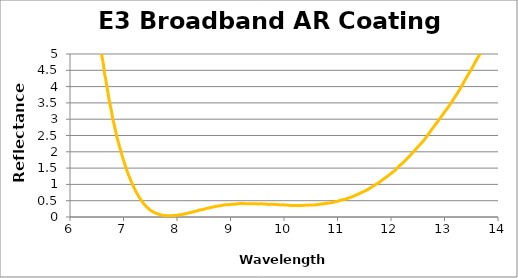
| Category | Reflectance (%) |
|---|---|
| 4.998841805 | 35.956 |
| 5.006891469999999 | 35.833 |
| 5.014941135 | 35.708 |
| 5.0229907990000005 | 35.578 |
| 5.031040463999999 | 35.447 |
| 5.039090129 | 35.316 |
| 5.047139794 | 35.184 |
| 5.055189458 | 35.05 |
| 5.063239123000001 | 34.912 |
| 5.0712887879999995 | 34.773 |
| 5.079338453 | 34.632 |
| 5.087388117000001 | 34.493 |
| 5.095437782 | 34.353 |
| 5.103487447 | 34.211 |
| 5.111537112 | 34.069 |
| 5.119586776 | 33.924 |
| 5.127636441 | 33.779 |
| 5.1356861060000005 | 33.634 |
| 5.143735770999999 | 33.486 |
| 5.151785435 | 33.334 |
| 5.1598351000000005 | 33.185 |
| 5.167884765 | 33.035 |
| 5.17593443 | 32.882 |
| 5.183984094 | 32.727 |
| 5.192033759 | 32.572 |
| 5.200083424000001 | 32.412 |
| 5.208133087999999 | 32.251 |
| 5.216182753 | 32.087 |
| 5.224232418 | 31.928 |
| 5.232282083 | 31.771 |
| 5.240331747 | 31.603 |
| 5.248381412 | 31.435 |
| 5.256431077 | 31.271 |
| 5.264480742 | 31.105 |
| 5.272530406 | 30.936 |
| 5.280580071 | 30.766 |
| 5.288629736 | 30.597 |
| 5.2966794010000005 | 30.424 |
| 5.304729065 | 30.257 |
| 5.31277873 | 30.09 |
| 5.3208283949999995 | 29.919 |
| 5.32887806 | 29.746 |
| 5.336927724 | 29.578 |
| 5.344977388999999 | 29.41 |
| 5.353027054 | 29.224 |
| 5.361076719 | 29.042 |
| 5.369126383 | 28.875 |
| 5.377176048 | 28.703 |
| 5.385225713 | 28.525 |
| 5.393275378 | 28.347 |
| 5.401325042000001 | 28.169 |
| 5.409374707 | 27.992 |
| 5.417424372 | 27.81 |
| 5.425474037 | 27.611 |
| 5.433523701 | 27.427 |
| 5.441573365999999 | 27.254 |
| 5.449623031 | 27.074 |
| 5.4576726959999995 | 26.895 |
| 5.46572236 | 26.702 |
| 5.473772025000001 | 26.508 |
| 5.481821689999999 | 26.322 |
| 5.489871354 | 26.139 |
| 5.4979210190000005 | 25.96 |
| 5.505970684 | 25.775 |
| 5.514020349 | 25.591 |
| 5.5220700129999996 | 25.401 |
| 5.530119678 | 25.211 |
| 5.538169343 | 25.03 |
| 5.5462190080000004 | 24.851 |
| 5.554268672 | 24.657 |
| 5.562318337 | 24.465 |
| 5.570368002 | 24.286 |
| 5.578417667 | 24.09 |
| 5.586467331 | 23.887 |
| 5.594516996 | 23.71 |
| 5.602566661 | 23.532 |
| 5.610616326000001 | 23.343 |
| 5.61866599 | 23.151 |
| 5.626715655 | 22.971 |
| 5.6347653200000005 | 22.795 |
| 5.642814985 | 22.589 |
| 5.650864649 | 22.376 |
| 5.658914314 | 22.191 |
| 5.666963979 | 22.02 |
| 5.675013644 | 21.834 |
| 5.6830633079999995 | 21.637 |
| 5.691112973 | 21.448 |
| 5.699162638 | 21.267 |
| 5.707212303 | 21.086 |
| 5.715261967 | 20.88 |
| 5.723311632 | 20.673 |
| 5.731361297 | 20.493 |
| 5.739410962 | 20.316 |
| 5.747460626 | 20.131 |
| 5.755510290999999 | 19.953 |
| 5.763559956 | 19.769 |
| 5.77160962 | 19.551 |
| 5.779659285 | 19.353 |
| 5.78770895 | 19.185 |
| 5.795758615 | 19.017 |
| 5.803808279 | 18.846 |
| 5.811857944000001 | 18.68 |
| 5.8199076089999995 | 18.491 |
| 5.827957274 | 18.255 |
| 5.836006938000001 | 18.056 |
| 5.844056603 | 17.895 |
| 5.852106267999999 | 17.738 |
| 5.860155933 | 17.561 |
| 5.868205597 | 17.379 |
| 5.876255262 | 17.202 |
| 5.8843049270000005 | 16.998 |
| 5.892354591999999 | 16.783 |
| 5.900404256 | 16.592 |
| 5.908453921 | 16.429 |
| 5.916503586 | 16.277 |
| 5.924553251 | 16.12 |
| 5.932602915 | 15.943 |
| 5.94065258 | 15.714 |
| 5.948702245000001 | 15.519 |
| 5.95675191 | 15.373 |
| 5.964801574 | 15.217 |
| 5.972851239 | 15.04 |
| 5.980900904 | 14.864 |
| 5.988950569 | 14.677 |
| 5.997000233 | 14.491 |
| 6.005049898 | 14.333 |
| 6.013099563 | 14.168 |
| 6.0211492280000005 | 13.989 |
| 6.029198892 | 13.836 |
| 6.037248557 | 13.705 |
| 6.045298222 | 13.528 |
| 6.053347885999999 | 13.298 |
| 6.061397551 | 13.122 |
| 6.0694472159999995 | 12.965 |
| 6.077496881 | 12.78 |
| 6.085546545000001 | 12.619 |
| 6.093596209999999 | 12.489 |
| 6.101645875 | 12.355 |
| 6.10969554 | 12.186 |
| 6.117745204 | 11.989 |
| 6.125794869 | 11.83 |
| 6.133844534 | 11.703 |
| 6.141894199 | 11.57 |
| 6.149943863000001 | 11.428 |
| 6.1579935279999996 | 11.28 |
| 6.166043193 | 11.137 |
| 6.174092858 | 11.016 |
| 6.182142522 | 10.887 |
| 6.190192187 | 10.738 |
| 6.198241852 | 10.605 |
| 6.2062915169999995 | 10.489 |
| 6.214341181 | 10.368 |
| 6.222390846000001 | 10.239 |
| 6.230440510999999 | 10.108 |
| 6.238490176 | 9.976 |
| 6.2465398400000005 | 9.843 |
| 6.254589505 | 9.714 |
| 6.262639170000001 | 9.585 |
| 6.270688835 | 9.452 |
| 6.278738499 | 9.317 |
| 6.286788164 | 9.184 |
| 6.294837829 | 9.051 |
| 6.302887493 | 8.92 |
| 6.310937158 | 8.794 |
| 6.318986823 | 8.671 |
| 6.327036488 | 8.553 |
| 6.335086152 | 8.434 |
| 6.343135817 | 8.297 |
| 6.351185482 | 8.158 |
| 6.359235147000001 | 8.042 |
| 6.367284811 | 7.928 |
| 6.375334476 | 7.799 |
| 6.3833841410000005 | 7.676 |
| 6.391433806 | 7.571 |
| 6.39948347 | 7.48 |
| 6.4075331349999995 | 7.376 |
| 6.4155828 | 7.218 |
| 6.423632465 | 7.059 |
| 6.4316821289999995 | 6.949 |
| 6.439731794 | 6.857 |
| 6.447781459 | 6.761 |
| 6.455831124 | 6.662 |
| 6.463880788 | 6.569 |
| 6.471930453 | 6.479 |
| 6.479980118 | 6.38 |
| 6.488029783 | 6.251 |
| 6.4960794470000005 | 6.111 |
| 6.504129111999999 | 6.007 |
| 6.512178777 | 5.926 |
| 6.520228442 | 5.835 |
| 6.528278106 | 5.736 |
| 6.536327771 | 5.645 |
| 6.5443774359999995 | 5.56 |
| 6.552427101 | 5.471 |
| 6.560476765000001 | 5.379 |
| 6.5685264299999995 | 5.279 |
| 6.576576095 | 5.174 |
| 6.584625759 | 5.074 |
| 6.592675424 | 4.983 |
| 6.600725089 | 4.9 |
| 6.608774754 | 4.826 |
| 6.616824418 | 4.757 |
| 6.624874083 | 4.68 |
| 6.6329237480000005 | 4.577 |
| 6.640973412999999 | 4.453 |
| 6.649023077 | 4.362 |
| 6.657072742 | 4.304 |
| 6.665122407 | 4.244 |
| 6.673172072000001 | 4.167 |
| 6.681221736 | 4.076 |
| 6.689271401 | 3.992 |
| 6.697321066000001 | 3.923 |
| 6.705370731 | 3.853 |
| 6.713420395 | 3.773 |
| 6.72147006 | 3.689 |
| 6.729519725 | 3.613 |
| 6.73756939 | 3.545 |
| 6.745619054 | 3.479 |
| 6.753668719 | 3.412 |
| 6.761718384 | 3.348 |
| 6.7697680490000005 | 3.286 |
| 6.777817713 | 3.22 |
| 6.785867378 | 3.141 |
| 6.793917043 | 3.059 |
| 6.801966708 | 2.992 |
| 6.810016372 | 2.938 |
| 6.8180660369999995 | 2.884 |
| 6.826115702 | 2.823 |
| 6.834165367 | 2.76 |
| 6.842215030999999 | 2.707 |
| 6.850264696 | 2.66 |
| 6.858314361 | 2.6 |
| 6.866364025 | 2.526 |
| 6.87441369 | 2.464 |
| 6.882463355 | 2.417 |
| 6.89051302 | 2.374 |
| 6.898562684000001 | 2.327 |
| 6.906612349 | 2.276 |
| 6.914662014 | 2.223 |
| 6.922711679 | 2.174 |
| 6.930761343 | 2.129 |
| 6.938811008 | 2.087 |
| 6.946860673 | 2.043 |
| 6.9549103379999995 | 1.994 |
| 6.962960002 | 1.941 |
| 6.971009667000001 | 1.89 |
| 6.979059331999999 | 1.848 |
| 6.987108997 | 1.808 |
| 6.9951586610000005 | 1.766 |
| 7.003208326 | 1.724 |
| 7.011257991000001 | 1.682 |
| 7.019307656 | 1.642 |
| 7.02735732 | 1.601 |
| 7.035406985 | 1.562 |
| 7.04345665 | 1.519 |
| 7.051506314999999 | 1.475 |
| 7.059555979 | 1.435 |
| 7.067605644 | 1.4 |
| 7.075655309 | 1.368 |
| 7.083704974000001 | 1.335 |
| 7.091754638 | 1.301 |
| 7.099804303 | 1.267 |
| 7.107853968000001 | 1.234 |
| 7.115903633 | 1.201 |
| 7.123953297 | 1.168 |
| 7.132002962 | 1.137 |
| 7.140052627 | 1.107 |
| 7.148102291 | 1.077 |
| 7.1561519559999995 | 1.045 |
| 7.164201621 | 1.014 |
| 7.172251286 | 0.983 |
| 7.1803009499999995 | 0.955 |
| 7.188350615 | 0.929 |
| 7.19640028 | 0.903 |
| 7.204449945 | 0.876 |
| 7.212499609 | 0.847 |
| 7.220549274 | 0.82 |
| 7.228598939 | 0.795 |
| 7.236648604 | 0.772 |
| 7.2446982680000005 | 0.749 |
| 7.252747932999999 | 0.725 |
| 7.260797598 | 0.702 |
| 7.268847263 | 0.677 |
| 7.276896927 | 0.652 |
| 7.284946592 | 0.627 |
| 7.2929962569999995 | 0.605 |
| 7.301045922 | 0.586 |
| 7.309095586000001 | 0.567 |
| 7.317145251 | 0.548 |
| 7.325194916 | 0.53 |
| 7.333244581 | 0.51 |
| 7.341294245 | 0.49 |
| 7.34934391 | 0.47 |
| 7.357393575 | 0.451 |
| 7.365443239999999 | 0.434 |
| 7.373492904 | 0.418 |
| 7.3815425690000005 | 0.402 |
| 7.389592233999999 | 0.388 |
| 7.397641898 | 0.373 |
| 7.405691563 | 0.359 |
| 7.413741228 | 0.345 |
| 7.421790893000001 | 0.33 |
| 7.429840557 | 0.316 |
| 7.437890222 | 0.302 |
| 7.445939887000001 | 0.29 |
| 7.453989552 | 0.278 |
| 7.462039216 | 0.267 |
| 7.470088881 | 0.254 |
| 7.478138546 | 0.242 |
| 7.486188211 | 0.23 |
| 7.494237875 | 0.219 |
| 7.50228754 | 0.209 |
| 7.510337205 | 0.199 |
| 7.5183868700000005 | 0.191 |
| 7.526436534 | 0.182 |
| 7.534486199 | 0.174 |
| 7.542535864 | 0.166 |
| 7.550585529 | 0.158 |
| 7.558635193 | 0.15 |
| 7.5666848579999995 | 0.144 |
| 7.574734523 | 0.137 |
| 7.582784188 | 0.132 |
| 7.590833851999999 | 0.127 |
| 7.598883517 | 0.122 |
| 7.606933182 | 0.117 |
| 7.614982847 | 0.111 |
| 7.623032511 | 0.106 |
| 7.631082176 | 0.1 |
| 7.639131841 | 0.095 |
| 7.647181506 | 0.091 |
| 7.65523117 | 0.087 |
| 7.663280834999999 | 0.084 |
| 7.6713305 | 0.081 |
| 7.679380164 | 0.078 |
| 7.687429829 | 0.074 |
| 7.695479494 | 0.07 |
| 7.7035291589999995 | 0.065 |
| 7.711578823 | 0.06 |
| 7.719628488000001 | 0.056 |
| 7.727678153 | 0.052 |
| 7.735727818 | 0.051 |
| 7.7437774820000005 | 0.049 |
| 7.751827147 | 0.048 |
| 7.759876812000001 | 0.047 |
| 7.767926477 | 0.045 |
| 7.775976141 | 0.043 |
| 7.784025806 | 0.042 |
| 7.792075471 | 0.041 |
| 7.800125135999999 | 0.039 |
| 7.8081748 | 0.037 |
| 7.816224465 | 0.036 |
| 7.82427413 | 0.036 |
| 7.832323795000001 | 0.037 |
| 7.840373459 | 0.038 |
| 7.848423124 | 0.039 |
| 7.856472789000001 | 0.04 |
| 7.864522454 | 0.041 |
| 7.872572118 | 0.041 |
| 7.880621783 | 0.041 |
| 7.888671448 | 0.041 |
| 7.896721113 | 0.041 |
| 7.9047707769999995 | 0.041 |
| 7.912820442 | 0.042 |
| 7.920870107 | 0.043 |
| 7.928919772 | 0.044 |
| 7.936969436 | 0.046 |
| 7.945019101 | 0.048 |
| 7.953068766 | 0.049 |
| 7.961118430000001 | 0.049 |
| 7.969168095 | 0.05 |
| 7.97721776 | 0.051 |
| 7.985267425 | 0.052 |
| 7.9933170890000005 | 0.054 |
| 8.001366754 | 0.056 |
| 8.009416419 | 0.057 |
| 8.017466084 | 0.059 |
| 8.025515748 | 0.061 |
| 8.033565413 | 0.063 |
| 8.041615078 | 0.065 |
| 8.049664743000001 | 0.068 |
| 8.057714407 | 0.069 |
| 8.065764072 | 0.071 |
| 8.073813737 | 0.072 |
| 8.081863402 | 0.073 |
| 8.089913066 | 0.075 |
| 8.097962730999999 | 0.078 |
| 8.106012396 | 0.081 |
| 8.114062061 | 0.085 |
| 8.122111725 | 0.089 |
| 8.13016139 | 0.092 |
| 8.138211055 | 0.095 |
| 8.14626072 | 0.097 |
| 8.154310384 | 0.099 |
| 8.162360049 | 0.102 |
| 8.170409714 | 0.104 |
| 8.178459379 | 0.107 |
| 8.186509043 | 0.111 |
| 8.194558708 | 0.115 |
| 8.202608372999999 | 0.119 |
| 8.210658038 | 0.122 |
| 8.218707702 | 0.126 |
| 8.226757367 | 0.129 |
| 8.234807032 | 0.132 |
| 8.242856696 | 0.134 |
| 8.250906361 | 0.138 |
| 8.258956026 | 0.141 |
| 8.267005691 | 0.144 |
| 8.275055355000001 | 0.147 |
| 8.28310502 | 0.15 |
| 8.291154684999999 | 0.153 |
| 8.29920435 | 0.157 |
| 8.307254014 | 0.16 |
| 8.315303679000001 | 0.164 |
| 8.323353344 | 0.168 |
| 8.331403008999999 | 0.171 |
| 8.339452673 | 0.175 |
| 8.347502338 | 0.177 |
| 8.355552003000001 | 0.18 |
| 8.363601668 | 0.183 |
| 8.371651331999999 | 0.186 |
| 8.379700997 | 0.189 |
| 8.387750662 | 0.194 |
| 8.395800327000002 | 0.198 |
| 8.403849991 | 0.203 |
| 8.411899656 | 0.208 |
| 8.419949321 | 0.212 |
| 8.427998986 | 0.215 |
| 8.43604865 | 0.218 |
| 8.444098315 | 0.22 |
| 8.45214798 | 0.221 |
| 8.460197645000001 | 0.223 |
| 8.468247309 | 0.224 |
| 8.476296974 | 0.226 |
| 8.484346639 | 0.229 |
| 8.492396303 | 0.232 |
| 8.500445968 | 0.236 |
| 8.508495633 | 0.24 |
| 8.516545297999999 | 0.244 |
| 8.524594961999998 | 0.248 |
| 8.532644627 | 0.252 |
| 8.540694292 | 0.256 |
| 8.548743957000001 | 0.26 |
| 8.556793621 | 0.264 |
| 8.564843285999999 | 0.267 |
| 8.572892951 | 0.269 |
| 8.580942616 | 0.271 |
| 8.588992280000001 | 0.274 |
| 8.597041945 | 0.276 |
| 8.605091609999999 | 0.279 |
| 8.613141275 | 0.283 |
| 8.621190939 | 0.287 |
| 8.629240604000001 | 0.291 |
| 8.637290269 | 0.296 |
| 8.645339933999999 | 0.299 |
| 8.653389598 | 0.303 |
| 8.661439263 | 0.305 |
| 8.669488928 | 0.307 |
| 8.677538593 | 0.308 |
| 8.685588257 | 0.31 |
| 8.693637922 | 0.312 |
| 8.701687587 | 0.314 |
| 8.709737252 | 0.318 |
| 8.717786916 | 0.322 |
| 8.725836581 | 0.327 |
| 8.733886246 | 0.33 |
| 8.741935911 | 0.333 |
| 8.749985575 | 0.334 |
| 8.75803524 | 0.335 |
| 8.766084905 | 0.337 |
| 8.774134569 | 0.339 |
| 8.782184234 | 0.341 |
| 8.790233899 | 0.343 |
| 8.798283564 | 0.345 |
| 8.806333228 | 0.346 |
| 8.814382893 | 0.348 |
| 8.822432558000001 | 0.35 |
| 8.830482223 | 0.353 |
| 8.838531886999998 | 0.356 |
| 8.846581552 | 0.359 |
| 8.854631217 | 0.362 |
| 8.862680882000001 | 0.365 |
| 8.870730546 | 0.368 |
| 8.878780210999999 | 0.37 |
| 8.886829876 | 0.372 |
| 8.894879541 | 0.374 |
| 8.902929205 | 0.376 |
| 8.910978870000001 | 0.377 |
| 8.919028534999999 | 0.378 |
| 8.9270782 | 0.378 |
| 8.935127864 | 0.378 |
| 8.943177529 | 0.378 |
| 8.951227194 | 0.378 |
| 8.959276859 | 0.378 |
| 8.967326523 | 0.379 |
| 8.975376188 | 0.38 |
| 8.983425853 | 0.382 |
| 8.991475518 | 0.384 |
| 8.999525182 | 0.386 |
| 9.007574846999999 | 0.388 |
| 9.015624512 | 0.389 |
| 9.023674177 | 0.39 |
| 9.031723841000002 | 0.39 |
| 9.039773506 | 0.391 |
| 9.047823171 | 0.391 |
| 9.055872835 | 0.391 |
| 9.0639225 | 0.391 |
| 9.071972165 | 0.392 |
| 9.08002183 | 0.393 |
| 9.088071494 | 0.394 |
| 9.096121159 | 0.396 |
| 9.104170824 | 0.398 |
| 9.112220488999998 | 0.399 |
| 9.120270153 | 0.401 |
| 9.128319818 | 0.402 |
| 9.136369483000001 | 0.404 |
| 9.144419148 | 0.405 |
| 9.152468811999999 | 0.407 |
| 9.160518477 | 0.409 |
| 9.168568142 | 0.411 |
| 9.176617807000001 | 0.412 |
| 9.184667471000001 | 0.413 |
| 9.192717135999999 | 0.413 |
| 9.200766801 | 0.413 |
| 9.208816466 | 0.413 |
| 9.21686613 | 0.413 |
| 9.224915795000001 | 0.413 |
| 9.232965459999999 | 0.413 |
| 9.241015125 | 0.412 |
| 9.249064789 | 0.412 |
| 9.257114454 | 0.411 |
| 9.265164119 | 0.41 |
| 9.273213784 | 0.409 |
| 9.281263447999999 | 0.409 |
| 9.289313113 | 0.409 |
| 9.297362778 | 0.409 |
| 9.305412443 | 0.409 |
| 9.313462107 | 0.41 |
| 9.321511772 | 0.41 |
| 9.329561437 | 0.41 |
| 9.337611101 | 0.41 |
| 9.345660766000002 | 0.41 |
| 9.353710431 | 0.409 |
| 9.361760096 | 0.408 |
| 9.36980976 | 0.407 |
| 9.377859425 | 0.406 |
| 9.385909089999998 | 0.407 |
| 9.393958755 | 0.407 |
| 9.402008419 | 0.408 |
| 9.410058084000001 | 0.409 |
| 9.418107749 | 0.41 |
| 9.426157413999999 | 0.41 |
| 9.434207078 | 0.41 |
| 9.442256743 | 0.409 |
| 9.450306408000001 | 0.41 |
| 9.458356073000001 | 0.41 |
| 9.466405736999999 | 0.409 |
| 9.474455402 | 0.409 |
| 9.482505067 | 0.407 |
| 9.490554732 | 0.405 |
| 9.498604396000001 | 0.403 |
| 9.506654060999999 | 0.401 |
| 9.514703726 | 0.399 |
| 9.522753391 | 0.399 |
| 9.530803055 | 0.4 |
| 9.538852720000001 | 0.401 |
| 9.546902385 | 0.403 |
| 9.55495205 | 0.404 |
| 9.563001714 | 0.405 |
| 9.571051379 | 0.405 |
| 9.579101044 | 0.405 |
| 9.587150708 | 0.404 |
| 9.595200372999999 | 0.403 |
| 9.603250038 | 0.402 |
| 9.611299703 | 0.402 |
| 9.619349367 | 0.401 |
| 9.627399032 | 0.401 |
| 9.635448697 | 0.401 |
| 9.643498362 | 0.4 |
| 9.651548026 | 0.399 |
| 9.659597691 | 0.397 |
| 9.667647356 | 0.395 |
| 9.675697021 | 0.392 |
| 9.683746685000001 | 0.39 |
| 9.69179635 | 0.388 |
| 9.699846014999999 | 0.387 |
| 9.70789568 | 0.386 |
| 9.715945344 | 0.386 |
| 9.723995009 | 0.386 |
| 9.732044674 | 0.387 |
| 9.740094338999999 | 0.387 |
| 9.748144003 | 0.388 |
| 9.756193668 | 0.389 |
| 9.764243333 | 0.39 |
| 9.772292998000001 | 0.39 |
| 9.780342661999999 | 0.39 |
| 9.788392327 | 0.39 |
| 9.796441992 | 0.389 |
| 9.804491657 | 0.389 |
| 9.812541321000001 | 0.388 |
| 9.820590986 | 0.387 |
| 9.828640650999999 | 0.387 |
| 9.836690316 | 0.386 |
| 9.84473998 | 0.386 |
| 9.852789645000001 | 0.385 |
| 9.86083931 | 0.384 |
| 9.868888973999999 | 0.382 |
| 9.876938639 | 0.38 |
| 9.884988304 | 0.378 |
| 9.893037969000002 | 0.376 |
| 9.901087633 | 0.375 |
| 9.909137298 | 0.373 |
| 9.917186963 | 0.372 |
| 9.925236628 | 0.372 |
| 9.933286292 | 0.372 |
| 9.941335957 | 0.372 |
| 9.949385622 | 0.373 |
| 9.957435287000001 | 0.373 |
| 9.965484951 | 0.373 |
| 9.973534616 | 0.374 |
| 9.981584281 | 0.373 |
| 9.989633946 | 0.373 |
| 9.99768361 | 0.372 |
| 10.005733275 | 0.372 |
| 10.013782939999999 | 0.372 |
| 10.021832605 | 0.372 |
| 10.029882269 | 0.372 |
| 10.037931934 | 0.371 |
| 10.045981599000001 | 0.37 |
| 10.054031263999999 | 0.368 |
| 10.062080927999999 | 0.366 |
| 10.070130593 | 0.364 |
| 10.078180258 | 0.362 |
| 10.086229923000001 | 0.36 |
| 10.094279587 | 0.359 |
| 10.102329251999999 | 0.358 |
| 10.110378917 | 0.356 |
| 10.118428582 | 0.355 |
| 10.126478246000001 | 0.354 |
| 10.134527911 | 0.353 |
| 10.142577575999999 | 0.353 |
| 10.15062724 | 0.352 |
| 10.158676905 | 0.353 |
| 10.166726570000002 | 0.353 |
| 10.174776235 | 0.353 |
| 10.182825899 | 0.354 |
| 10.190875564 | 0.354 |
| 10.198925229 | 0.354 |
| 10.206974894 | 0.353 |
| 10.215024558 | 0.352 |
| 10.223074223 | 0.351 |
| 10.231123888 | 0.351 |
| 10.239173553 | 0.351 |
| 10.247223217 | 0.351 |
| 10.255272882 | 0.351 |
| 10.263322547 | 0.352 |
| 10.271372212000001 | 0.354 |
| 10.279421876 | 0.355 |
| 10.287471541 | 0.356 |
| 10.295521206 | 0.356 |
| 10.303570871 | 0.356 |
| 10.311620535 | 0.355 |
| 10.319670200000001 | 0.355 |
| 10.327719864999999 | 0.354 |
| 10.33576953 | 0.354 |
| 10.343819194 | 0.355 |
| 10.351868859 | 0.355 |
| 10.359918524000001 | 0.357 |
| 10.367968188999999 | 0.358 |
| 10.376017852999999 | 0.36 |
| 10.384067518 | 0.361 |
| 10.392117183 | 0.363 |
| 10.400166848000001 | 0.364 |
| 10.408216512000001 | 0.365 |
| 10.416266176999999 | 0.365 |
| 10.424315842 | 0.364 |
| 10.432365506 | 0.364 |
| 10.440415171 | 0.364 |
| 10.448464836 | 0.364 |
| 10.456514501 | 0.363 |
| 10.464564165 | 0.364 |
| 10.47261383 | 0.365 |
| 10.480663495 | 0.366 |
| 10.48871316 | 0.367 |
| 10.496762824 | 0.368 |
| 10.504812489 | 0.368 |
| 10.512862154 | 0.368 |
| 10.520911819 | 0.368 |
| 10.528961483 | 0.368 |
| 10.537011148 | 0.367 |
| 10.545060813 | 0.368 |
| 10.553110478 | 0.368 |
| 10.561160142 | 0.369 |
| 10.569209807 | 0.37 |
| 10.577259472 | 0.371 |
| 10.585309137 | 0.372 |
| 10.593358801 | 0.373 |
| 10.601408466 | 0.375 |
| 10.609458131 | 0.376 |
| 10.617507796 | 0.377 |
| 10.62555746 | 0.378 |
| 10.633607125000001 | 0.38 |
| 10.641656789999999 | 0.382 |
| 10.649706454999999 | 0.384 |
| 10.657756119 | 0.387 |
| 10.665805784 | 0.39 |
| 10.673855449000001 | 0.393 |
| 10.681905113000001 | 0.396 |
| 10.689954777999999 | 0.399 |
| 10.698004443 | 0.401 |
| 10.706054108 | 0.402 |
| 10.714103772 | 0.403 |
| 10.722153437000001 | 0.403 |
| 10.730203101999999 | 0.403 |
| 10.738252767 | 0.404 |
| 10.746302431 | 0.405 |
| 10.754352096 | 0.407 |
| 10.762401761 | 0.409 |
| 10.770451426 | 0.412 |
| 10.778501089999999 | 0.414 |
| 10.786550755 | 0.417 |
| 10.79460042 | 0.42 |
| 10.802650085 | 0.422 |
| 10.810699749 | 0.424 |
| 10.818749414 | 0.425 |
| 10.826799079 | 0.426 |
| 10.834848744 | 0.426 |
| 10.842898408 | 0.427 |
| 10.850948073 | 0.428 |
| 10.858997738 | 0.429 |
| 10.867047403 | 0.431 |
| 10.875097067 | 0.434 |
| 10.883146731999998 | 0.437 |
| 10.891196397 | 0.44 |
| 10.899246062 | 0.444 |
| 10.907295726000001 | 0.447 |
| 10.915345391 | 0.451 |
| 10.923395055999999 | 0.454 |
| 10.931444721 | 0.457 |
| 10.939494385 | 0.46 |
| 10.947544050000001 | 0.462 |
| 10.955593715000001 | 0.465 |
| 10.963643378999999 | 0.468 |
| 10.971693044 | 0.471 |
| 10.979742709 | 0.474 |
| 10.987792374000001 | 0.477 |
| 10.995842038000001 | 0.481 |
| 11.003891702999999 | 0.484 |
| 11.011941368 | 0.488 |
| 11.019991033 | 0.493 |
| 11.028040697 | 0.497 |
| 11.036090362000001 | 0.502 |
| 11.044140027 | 0.506 |
| 11.052189692 | 0.51 |
| 11.060239356 | 0.514 |
| 11.068289021 | 0.518 |
| 11.076338686 | 0.521 |
| 11.084388351 | 0.524 |
| 11.092438014999999 | 0.527 |
| 11.10048768 | 0.53 |
| 11.108537345 | 0.532 |
| 11.11658701 | 0.535 |
| 11.124636674 | 0.538 |
| 11.132686339 | 0.541 |
| 11.140736004 | 0.545 |
| 11.148785669 | 0.548 |
| 11.156835333 | 0.552 |
| 11.164884998 | 0.556 |
| 11.172934663 | 0.561 |
| 11.180984328000001 | 0.565 |
| 11.189033992 | 0.57 |
| 11.197083656999999 | 0.574 |
| 11.205133322 | 0.579 |
| 11.213182987 | 0.584 |
| 11.221232651000001 | 0.588 |
| 11.229282316 | 0.593 |
| 11.237331980999999 | 0.598 |
| 11.245381645 | 0.603 |
| 11.25343131 | 0.608 |
| 11.261480975 | 0.614 |
| 11.269530640000001 | 0.619 |
| 11.277580303999999 | 0.624 |
| 11.285629969 | 0.629 |
| 11.293679634 | 0.634 |
| 11.301729299 | 0.639 |
| 11.309778963000001 | 0.645 |
| 11.317828628 | 0.651 |
| 11.325878293 | 0.657 |
| 11.333927958 | 0.663 |
| 11.341977622 | 0.669 |
| 11.350027287000001 | 0.675 |
| 11.358076952 | 0.681 |
| 11.366126616999999 | 0.687 |
| 11.374176281 | 0.693 |
| 11.382225946 | 0.699 |
| 11.390275611 | 0.705 |
| 11.398325276 | 0.71 |
| 11.40637494 | 0.717 |
| 11.414424605 | 0.723 |
| 11.42247427 | 0.729 |
| 11.430523935 | 0.736 |
| 11.438573599 | 0.742 |
| 11.446623264 | 0.749 |
| 11.454672929000001 | 0.756 |
| 11.462722594 | 0.762 |
| 11.470772258 | 0.769 |
| 11.478821923 | 0.775 |
| 11.486871588 | 0.78 |
| 11.494921253000001 | 0.786 |
| 11.502970917 | 0.792 |
| 11.511020581999999 | 0.797 |
| 11.519070247 | 0.803 |
| 11.527119911 | 0.809 |
| 11.535169576 | 0.816 |
| 11.543219241000001 | 0.822 |
| 11.551268905999999 | 0.829 |
| 11.55931857 | 0.837 |
| 11.567368235 | 0.845 |
| 11.5754179 | 0.853 |
| 11.583467565000001 | 0.861 |
| 11.591517228999999 | 0.869 |
| 11.599566893999999 | 0.878 |
| 11.607616559 | 0.886 |
| 11.615666224 | 0.894 |
| 11.623715888000001 | 0.902 |
| 11.631765553 | 0.91 |
| 11.639815217999999 | 0.919 |
| 11.647864883 | 0.927 |
| 11.655914547 | 0.936 |
| 11.663964212000002 | 0.945 |
| 11.672013877 | 0.953 |
| 11.680063542 | 0.962 |
| 11.688113206 | 0.97 |
| 11.696162871 | 0.978 |
| 11.704212535999998 | 0.987 |
| 11.712262201 | 0.994 |
| 11.720311865 | 1.002 |
| 11.72836153 | 1.009 |
| 11.736411195 | 1.017 |
| 11.744460859999998 | 1.025 |
| 11.752510524 | 1.033 |
| 11.760560189 | 1.041 |
| 11.768609854000001 | 1.05 |
| 11.776659518 | 1.059 |
| 11.784709183 | 1.068 |
| 11.792758848 | 1.078 |
| 11.800808513 | 1.088 |
| 11.808858177 | 1.098 |
| 11.816907842 | 1.108 |
| 11.824957506999999 | 1.118 |
| 11.833007172 | 1.129 |
| 11.841056836 | 1.139 |
| 11.849106501 | 1.15 |
| 11.857156166000001 | 1.16 |
| 11.865205830999999 | 1.17 |
| 11.873255494999999 | 1.18 |
| 11.88130516 | 1.19 |
| 11.889354825 | 1.199 |
| 11.897404490000001 | 1.209 |
| 11.905454154 | 1.218 |
| 11.913503818999999 | 1.227 |
| 11.921553484 | 1.237 |
| 11.929603149 | 1.246 |
| 11.937652813000001 | 1.256 |
| 11.945702478 | 1.266 |
| 11.953752142999999 | 1.276 |
| 11.961801808 | 1.286 |
| 11.969851472 | 1.296 |
| 11.977901137 | 1.306 |
| 11.985950802 | 1.317 |
| 11.994000467 | 1.327 |
| 12.002050131 | 1.337 |
| 12.010099796 | 1.346 |
| 12.018149461 | 1.356 |
| 12.026199126 | 1.366 |
| 12.03424879 | 1.375 |
| 12.042298455000001 | 1.386 |
| 12.05034812 | 1.396 |
| 12.058397784 | 1.406 |
| 12.066447449 | 1.418 |
| 12.074497114 | 1.43 |
| 12.082546779 | 1.442 |
| 12.090596443 | 1.455 |
| 12.098646108 | 1.469 |
| 12.106695773 | 1.483 |
| 12.114745438 | 1.496 |
| 12.122795102 | 1.51 |
| 12.130844767000001 | 1.524 |
| 12.138894431999999 | 1.538 |
| 12.146944097 | 1.551 |
| 12.154993761 | 1.564 |
| 12.163043426 | 1.577 |
| 12.171093091000001 | 1.589 |
| 12.179142756 | 1.601 |
| 12.187192419999999 | 1.612 |
| 12.195242085 | 1.623 |
| 12.20329175 | 1.635 |
| 12.211341415000001 | 1.646 |
| 12.219391079000001 | 1.658 |
| 12.227440743999999 | 1.669 |
| 12.235490409 | 1.681 |
| 12.243540074 | 1.694 |
| 12.251589738 | 1.706 |
| 12.259639403 | 1.719 |
| 12.267689068 | 1.732 |
| 12.275738733 | 1.746 |
| 12.283788397 | 1.76 |
| 12.291838062 | 1.773 |
| 12.299887727 | 1.787 |
| 12.307937392 | 1.8 |
| 12.315987055999999 | 1.814 |
| 12.324036721 | 1.828 |
| 12.332086386 | 1.841 |
| 12.34013605 | 1.855 |
| 12.348185715 | 1.868 |
| 12.35623538 | 1.883 |
| 12.364285045 | 1.897 |
| 12.372334709 | 1.912 |
| 12.380384374 | 1.927 |
| 12.388434039 | 1.943 |
| 12.396483704 | 1.958 |
| 12.404533368000001 | 1.974 |
| 12.412583033 | 1.989 |
| 12.420632697999999 | 2.004 |
| 12.428682363 | 2.019 |
| 12.436732027 | 2.034 |
| 12.444781692000001 | 2.048 |
| 12.452831356999999 | 2.062 |
| 12.460881021999999 | 2.076 |
| 12.468930686 | 2.091 |
| 12.476980351 | 2.105 |
| 12.485030016000001 | 2.119 |
| 12.493079681 | 2.134 |
| 12.501129344999999 | 2.148 |
| 12.50917901 | 2.163 |
| 12.517228675 | 2.177 |
| 12.525278340000002 | 2.192 |
| 12.533328004000001 | 2.206 |
| 12.541377669 | 2.22 |
| 12.549427334 | 2.234 |
| 12.557476999 | 2.248 |
| 12.565526663 | 2.263 |
| 12.573576328 | 2.277 |
| 12.581625993 | 2.291 |
| 12.589675658 | 2.306 |
| 12.597725322 | 2.322 |
| 12.605774987 | 2.337 |
| 12.613824652 | 2.353 |
| 12.621874316 | 2.369 |
| 12.629923981 | 2.386 |
| 12.637973646 | 2.403 |
| 12.646023311 | 2.42 |
| 12.654072974999998 | 2.438 |
| 12.66212264 | 2.455 |
| 12.670172305 | 2.473 |
| 12.678221970000001 | 2.491 |
| 12.686271634 | 2.51 |
| 12.694321298999999 | 2.529 |
| 12.702370964 | 2.547 |
| 12.710420629 | 2.566 |
| 12.718470293000001 | 2.585 |
| 12.726519958 | 2.604 |
| 12.734569622999999 | 2.623 |
| 12.742619288 | 2.642 |
| 12.750668952 | 2.66 |
| 12.758718617000001 | 2.679 |
| 12.766768282000001 | 2.697 |
| 12.774817946999999 | 2.715 |
| 12.782867611 | 2.733 |
| 12.790917276 | 2.75 |
| 12.798966941 | 2.767 |
| 12.807016606 | 2.785 |
| 12.815066269999999 | 2.802 |
| 12.823115935 | 2.82 |
| 12.8311656 | 2.837 |
| 12.839215265 | 2.855 |
| 12.847264929000001 | 2.873 |
| 12.855314594 | 2.891 |
| 12.863364259 | 2.909 |
| 12.871413923 | 2.927 |
| 12.879463588 | 2.945 |
| 12.887513253 | 2.963 |
| 12.895562918 | 2.981 |
| 12.903612582 | 2.999 |
| 12.911662247 | 3.017 |
| 12.919711912 | 3.034 |
| 12.927761577 | 3.052 |
| 12.935811241 | 3.07 |
| 12.943860906 | 3.089 |
| 12.951910571 | 3.107 |
| 12.959960236 | 3.125 |
| 12.968009899999998 | 3.144 |
| 12.976059565 | 3.162 |
| 12.98410923 | 3.181 |
| 12.992158895000001 | 3.199 |
| 13.000208559 | 3.218 |
| 13.008258223999999 | 3.236 |
| 13.016307889 | 3.254 |
| 13.024357554 | 3.272 |
| 13.032407218 | 3.29 |
| 13.040456883000001 | 3.308 |
| 13.048506547999999 | 3.325 |
| 13.056556213 | 3.343 |
| 13.064605877 | 3.36 |
| 13.072655542 | 3.378 |
| 13.080705207000001 | 3.396 |
| 13.088754871999999 | 3.413 |
| 13.096804536 | 3.432 |
| 13.104854201 | 3.451 |
| 13.112903866 | 3.471 |
| 13.120953531 | 3.491 |
| 13.129003195 | 3.511 |
| 13.137052859999999 | 3.532 |
| 13.145102525 | 3.553 |
| 13.153152189 | 3.575 |
| 13.161201854000002 | 3.596 |
| 13.169251519 | 3.616 |
| 13.177301184 | 3.636 |
| 13.185350848 | 3.657 |
| 13.193400513 | 3.677 |
| 13.201450178 | 3.697 |
| 13.209499843 | 3.716 |
| 13.217549507 | 3.736 |
| 13.225599172 | 3.755 |
| 13.233648837 | 3.776 |
| 13.241698501999998 | 3.797 |
| 13.249748166 | 3.819 |
| 13.257797831 | 3.84 |
| 13.265847496000001 | 3.862 |
| 13.273897161 | 3.885 |
| 13.281946825 | 3.908 |
| 13.28999649 | 3.931 |
| 13.298046155 | 3.954 |
| 13.306095820000001 | 3.977 |
| 13.314145484 | 4 |
| 13.322195148999999 | 4.023 |
| 13.330244814 | 4.046 |
| 13.338294479 | 4.069 |
| 13.346344143 | 4.091 |
| 13.354393808000001 | 4.114 |
| 13.362443472999999 | 4.137 |
| 13.370493138 | 4.161 |
| 13.378542802 | 4.184 |
| 13.386592467 | 4.208 |
| 13.394642132000001 | 4.231 |
| 13.402691797 | 4.255 |
| 13.410741460999999 | 4.278 |
| 13.418791126 | 4.301 |
| 13.426840791 | 4.325 |
| 13.434890455000001 | 4.348 |
| 13.44294012 | 4.37 |
| 13.450989784999999 | 4.392 |
| 13.45903945 | 4.414 |
| 13.467089114 | 4.436 |
| 13.475138779000002 | 4.458 |
| 13.483188444 | 4.48 |
| 13.491238109 | 4.502 |
| 13.499287773 | 4.524 |
| 13.507337438 | 4.547 |
| 13.515387102999998 | 4.571 |
| 13.523436768 | 4.595 |
| 13.531486432 | 4.618 |
| 13.539536097000001 | 4.642 |
| 13.547585762 | 4.667 |
| 13.555635426999999 | 4.692 |
| 13.563685091 | 4.717 |
| 13.571734756 | 4.742 |
| 13.579784421000001 | 4.766 |
| 13.587834086 | 4.79 |
| 13.59588375 | 4.813 |
| 13.603933415 | 4.837 |
| 13.61198308 | 4.86 |
| 13.620032745 | 4.883 |
| 13.628082409000001 | 4.905 |
| 13.636132073999999 | 4.927 |
| 13.644181739 | 4.949 |
| 13.652231404 | 4.971 |
| 13.660281068 | 4.994 |
| 13.668330733000001 | 5.016 |
| 13.676380398 | 5.038 |
| 13.684430063 | 5.061 |
| 13.692479727 | 5.085 |
| 13.700529392 | 5.109 |
| 13.708579057000001 | 5.133 |
| 13.716628721 | 5.157 |
| 13.724678385999999 | 5.183 |
| 13.732728051 | 5.208 |
| 13.740777716 | 5.234 |
| 13.74882738 | 5.259 |
| 13.756877045 | 5.285 |
| 13.76492671 | 5.311 |
| 13.772976375 | 5.337 |
| 13.781026039 | 5.363 |
| 13.789075704 | 5.389 |
| 13.797125369 | 5.415 |
| 13.805175034 | 5.44 |
| 13.813224698 | 5.466 |
| 13.821274363 | 5.492 |
| 13.829324028 | 5.517 |
| 13.837373693 | 5.543 |
| 13.845423357 | 5.568 |
| 13.853473022 | 5.594 |
| 13.861522687 | 5.619 |
| 13.869572351999999 | 5.645 |
| 13.877622016 | 5.671 |
| 13.885671681 | 5.696 |
| 13.893721346 | 5.722 |
| 13.901771011000001 | 5.747 |
| 13.909820675 | 5.772 |
| 13.91787034 | 5.797 |
| 13.925920005 | 5.822 |
| 13.93396967 | 5.846 |
| 13.942019334000001 | 5.871 |
| 13.950068998999999 | 5.895 |
| 13.958118663999999 | 5.918 |
| 13.966168328 | 5.942 |
| 13.974217993 | 5.966 |
| 13.982267658000001 | 5.989 |
| 13.990317323 | 6.013 |
| 13.998366986999999 | 6.037 |
| 14.006416652 | 6.06 |
| 14.014466317 | 6.084 |
| 14.022515982000002 | 6.108 |
| 14.030565646 | 6.133 |
| 14.038615311 | 6.158 |
| 14.046664976 | 6.182 |
| 14.054714641 | 6.207 |
| 14.062764305 | 6.234 |
| 14.07081397 | 6.26 |
| 14.078863635 | 6.286 |
| 14.0869133 | 6.312 |
| 14.094962964 | 6.339 |
| 14.103012629 | 6.366 |
| 14.111062294 | 6.394 |
| 14.119111959 | 6.421 |
| 14.127161623 | 6.448 |
| 14.135211288 | 6.476 |
| 14.143260953 | 6.503 |
| 14.151310618 | 6.531 |
| 14.159360282 | 6.558 |
| 14.167409947 | 6.586 |
| 14.175459612000001 | 6.613 |
| 14.183509276999999 | 6.641 |
| 14.191558940999998 | 6.668 |
| 14.199608606 | 6.695 |
| 14.207658271 | 6.722 |
| 14.215707936000001 | 6.75 |
| 14.2237576 | 6.777 |
| 14.231807264999999 | 6.805 |
| 14.23985693 | 6.832 |
| 14.247906594 | 6.86 |
| 14.255956259000001 | 6.888 |
| 14.264005924 | 6.917 |
| 14.272055588999999 | 6.945 |
| 14.280105253 | 6.973 |
| 14.288154918 | 7.001 |
| 14.296204583000002 | 7.03 |
| 14.304254248 | 7.059 |
| 14.312303911999999 | 7.088 |
| 14.320353577 | 7.117 |
| 14.328403242 | 7.146 |
| 14.336452907 | 7.175 |
| 14.344502571000001 | 7.204 |
| 14.352552236 | 7.233 |
| 14.360601901 | 7.262 |
| 14.368651566 | 7.29 |
| 14.37670123 | 7.318 |
| 14.384750895 | 7.346 |
| 14.39280056 | 7.374 |
| 14.400850225000001 | 7.402 |
| 14.408899889 | 7.43 |
| 14.416949554 | 7.458 |
| 14.424999219 | 7.486 |
| 14.433048884 | 7.513 |
| 14.441098548 | 7.541 |
| 14.449148213 | 7.569 |
| 14.457197878 | 7.598 |
| 14.465247543 | 7.628 |
| 14.473297207 | 7.657 |
| 14.481346872 | 7.686 |
| 14.489396537000001 | 7.716 |
| 14.497446201999999 | 7.747 |
| 14.505495865999999 | 7.777 |
| 14.513545531 | 7.808 |
| 14.521595196 | 7.839 |
| 14.529644860000001 | 7.869 |
| 14.537694525000001 | 7.899 |
| 14.545744189999999 | 7.929 |
| 14.553793855 | 7.96 |
| 14.561843519 | 7.99 |
| 14.569893184 | 8.019 |
| 14.577942849 | 8.048 |
| 14.585992513999999 | 8.076 |
| 14.594042178 | 8.105 |
| 14.602091843 | 8.133 |
| 14.610141508 | 8.162 |
| 14.618191173 | 8.191 |
| 14.626240837 | 8.22 |
| 14.634290502 | 8.248 |
| 14.642340167 | 8.277 |
| 14.650389832 | 8.306 |
| 14.658439496000002 | 8.337 |
| 14.666489161 | 8.367 |
| 14.674538826 | 8.397 |
| 14.682588491 | 8.427 |
| 14.690638155 | 8.457 |
| 14.69868782 | 8.488 |
| 14.706737485 | 8.519 |
| 14.71478715 | 8.55 |
| 14.722836814 | 8.581 |
| 14.730886479 | 8.612 |
| 14.738936144 | 8.643 |
| 14.746985809 | 8.674 |
| 14.755035473 | 8.704 |
| 14.763085138000001 | 8.735 |
| 14.771134803 | 8.766 |
| 14.779184467999999 | 8.795 |
| 14.787234132 | 8.824 |
| 14.795283797 | 8.853 |
| 14.803333462000001 | 8.882 |
| 14.811383126 | 8.91 |
| 14.819432790999999 | 8.938 |
| 14.827482456 | 8.963 |
| 14.835532121 | 8.988 |
| 14.843581785 | 9.014 |
| 14.851631450000001 | 9.039 |
| 14.859681114999999 | 9.064 |
| 14.86773078 | 9.088 |
| 14.875780444 | 9.112 |
| 14.883830109 | 9.136 |
| 14.891879774000001 | 9.16 |
| 14.899929439 | 9.184 |
| 14.907979102999999 | 9.215 |
| 14.916028768 | 9.248 |
| 14.924078433 | 9.28 |
| 14.932128098 | 9.312 |
| 14.940177762 | 9.344 |
| 14.948227426999999 | 9.382 |
| 14.956277092 | 9.425 |
| 14.964326757 | 9.467 |
| 14.972376421000002 | 9.509 |
| 14.980426086 | 9.552 |
| 14.988475751 | 9.592 |
| 14.996525416 | 9.626 |
| 15.00457508 | 9.661 |